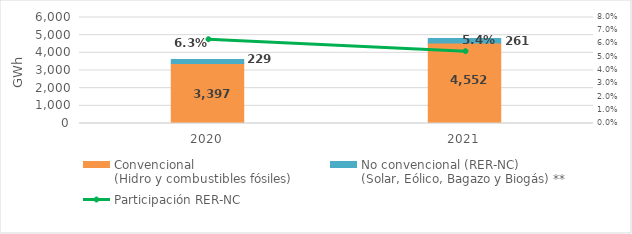
| Category | Convencional
(Hidro y combustibles fósiles) | No convencional (RER-NC)
(Solar, Eólico, Bagazo y Biogás) ** |
|---|---|---|
| 2020.0 | 3396.51 | 229.218 |
| 2021.0 | 4551.514 | 260.9 |